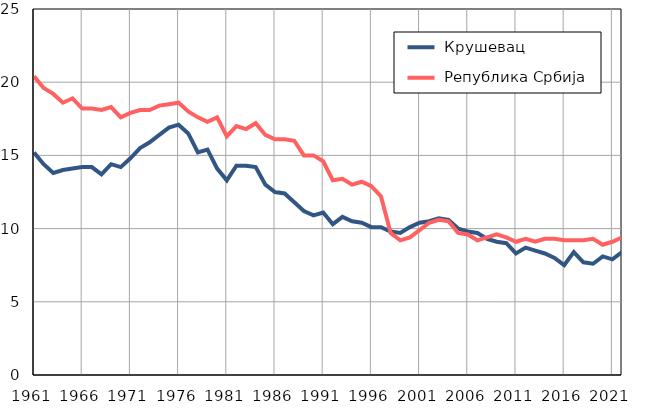
| Category |  Крушевац |  Република Србија |
|---|---|---|
| 1961.0 | 15.2 | 20.4 |
| 1962.0 | 14.4 | 19.6 |
| 1963.0 | 13.8 | 19.2 |
| 1964.0 | 14 | 18.6 |
| 1965.0 | 14.1 | 18.9 |
| 1966.0 | 14.2 | 18.2 |
| 1967.0 | 14.2 | 18.2 |
| 1968.0 | 13.7 | 18.1 |
| 1969.0 | 14.4 | 18.3 |
| 1970.0 | 14.2 | 17.6 |
| 1971.0 | 14.8 | 17.9 |
| 1972.0 | 15.5 | 18.1 |
| 1973.0 | 15.9 | 18.1 |
| 1974.0 | 16.4 | 18.4 |
| 1975.0 | 16.9 | 18.5 |
| 1976.0 | 17.1 | 18.6 |
| 1977.0 | 16.5 | 18 |
| 1978.0 | 15.2 | 17.6 |
| 1979.0 | 15.4 | 17.3 |
| 1980.0 | 14.1 | 17.6 |
| 1981.0 | 13.3 | 16.3 |
| 1982.0 | 14.3 | 17 |
| 1983.0 | 14.3 | 16.8 |
| 1984.0 | 14.2 | 17.2 |
| 1985.0 | 13 | 16.4 |
| 1986.0 | 12.5 | 16.1 |
| 1987.0 | 12.4 | 16.1 |
| 1988.0 | 11.8 | 16 |
| 1989.0 | 11.2 | 15 |
| 1990.0 | 10.9 | 15 |
| 1991.0 | 11.1 | 14.6 |
| 1992.0 | 10.3 | 13.3 |
| 1993.0 | 10.8 | 13.4 |
| 1994.0 | 10.5 | 13 |
| 1995.0 | 10.4 | 13.2 |
| 1996.0 | 10.1 | 12.9 |
| 1997.0 | 10.1 | 12.2 |
| 1998.0 | 9.8 | 9.7 |
| 1999.0 | 9.7 | 9.2 |
| 2000.0 | 10.1 | 9.4 |
| 2001.0 | 10.4 | 9.9 |
| 2002.0 | 10.5 | 10.4 |
| 2003.0 | 10.7 | 10.6 |
| 2004.0 | 10.6 | 10.5 |
| 2005.0 | 10 | 9.7 |
| 2006.0 | 9.8 | 9.6 |
| 2007.0 | 9.7 | 9.2 |
| 2008.0 | 9.3 | 9.4 |
| 2009.0 | 9.1 | 9.6 |
| 2010.0 | 9 | 9.4 |
| 2011.0 | 8.3 | 9.1 |
| 2012.0 | 8.7 | 9.3 |
| 2013.0 | 8.5 | 9.1 |
| 2014.0 | 8.3 | 9.3 |
| 2015.0 | 8 | 9.3 |
| 2016.0 | 7.5 | 9.2 |
| 2017.0 | 8.4 | 9.2 |
| 2018.0 | 7.7 | 9.2 |
| 2019.0 | 7.6 | 9.3 |
| 2020.0 | 8.1 | 8.9 |
| 2021.0 | 7.9 | 9.1 |
| 2022.0 | 8.4 | 9.4 |